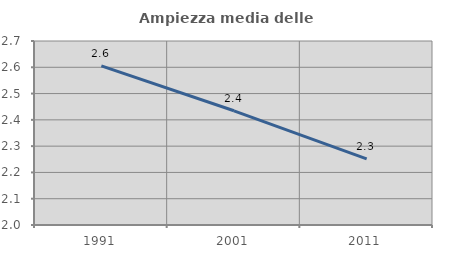
| Category | Ampiezza media delle famiglie |
|---|---|
| 1991.0 | 2.606 |
| 2001.0 | 2.435 |
| 2011.0 | 2.252 |